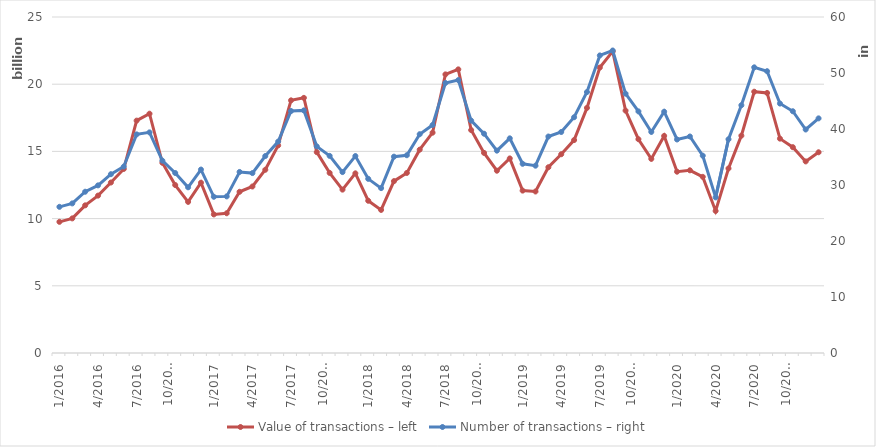
| Category | Value of transactions – left |
|---|---|
| 1/2016 | 9759602843 |
| 2/2016 | 10015590417 |
| 3/2016 | 10986665753 |
| 4/2016 | 11710392473 |
| 5/2016 | 12684892572 |
| 6/2016 | 13695129318 |
| 7/2016 | 17289715055 |
| 8/2016 | 17804659243 |
| 9/2016 | 14152394312 |
| 10/2016 | 12495649089 |
| 11/2016 | 11242882731 |
| 12/2016 | 12669662952 |
| 1/2017 | 10310547061 |
| 2/2017 | 10398491846 |
| 3/2017 | 11994769173 |
| 4/2017 | 12388647476 |
| 5/2017 | 13632022458 |
| 6/2017 | 15446235173 |
| 7/2017 | 18797792554 |
| 8/2017 | 18982858496 |
| 9/2017 | 14944597785 |
| 10/2017 | 13399521673 |
| 11/2017 | 12155625084 |
| 12/2017 | 13365620959 |
| 1/2018 | 11327955279 |
| 2/2018 | 10645067043 |
| 3/2018 | 12788121928 |
| 4/2018 | 13395587705 |
| 5/2018 | 15128786893 |
| 6/2018 | 16392146429 |
| 7/2018 | 20731532406 |
| 8/2018 | 21103740569 |
| 9/2018 | 16586071370 |
| 10/2018 | 14887845757 |
| 11/2018 | 13562836637 |
| 12/2018 | 14476589773 |
| 1/2019 | 12082836400 |
| 2/2019 | 12016501373 |
| 3/2019 | 13819618331 |
| 4/2019 | 14789669198 |
| 5/2019 | 15842321717 |
| 6/2019 | 18238353840 |
| 7/2019 | 21237412017 |
| 8/2019 | 22438338990 |
| 9/2019 | 18034387996 |
| 10/2019 | 15906473483 |
| 11/2019 | 14442935226 |
| 12/2019 | 16153601502 |
| 1/2020 | 13489854128 |
| 2/2020 | 13593139510 |
| 3/2020 | 13106412805 |
| 4/2020 | 10569917273 |
| 5/2020 | 13731527064 |
| 6/2020 | 16170454145 |
| 7/2020 | 19441365974 |
| 8/2020 | 19347774788 |
| 9/2020 | 15949377831 |
| 10/2020 | 15314545648 |
| 11/2020 | 14254625129 |
| 12/2020 | 14935397451 |